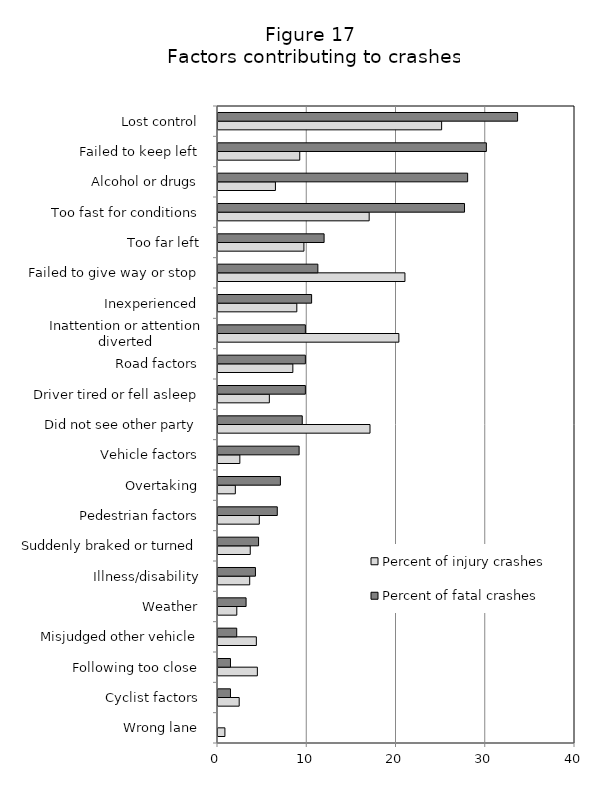
| Category | Percent of injury crashes | Percent of fatal crashes |
|---|---|---|
| Wrong lane  | 0.775 | 0 |
| Cyclist factors  | 2.376 | 1.399 |
| Following too close  | 4.41 | 1.399 |
| Misjudged other vehicle  | 4.297 | 2.098 |
| Weather  | 2.107 | 3.147 |
| Illness/disability  | 3.553 | 4.196 |
| Suddenly braked or turned  | 3.615 | 4.545 |
| Pedestrian factors  | 4.627 | 6.643 |
| Overtaking  | 1.942 | 6.993 |
| Vehicle factors  | 2.448 | 9.091 |
| Did not see other party  | 17.032 | 9.441 |
| Driver tired or fell asleep  | 5.753 | 9.79 |
| Road factors  | 8.387 | 9.79 |
| Inattention or attention diverted  | 20.264 | 9.79 |
| Inexperienced  | 8.831 | 10.49 |
| Failed to give way or stop  | 20.946 | 11.189 |
| Too far left  | 9.626 | 11.888 |
| Too fast for conditions  | 16.939 | 27.622 |
| Alcohol or drugs  | 6.435 | 27.972 |
| Failed to keep left  | 9.161 | 30.07 |
| Lost control  | 25.057 | 33.566 |